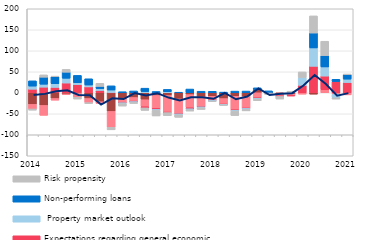
| Category | Costs of funding | Competition from other banks | Expectations regarding general economic situation |  Property market outlook | Non-performing loans  | Risk propensity |
|---|---|---|---|---|---|---|
| 2014.0 | -27.614 | -10.883 | 8.513 | 7.366 | 12.572 | -2.931 |
| nan | -30.154 | -23.565 | 13.381 | 6.958 | 16.79 | 5.591 |
| nan | -13.58 | -4.04 | 12.84 | 8.698 | 16.68 | 1.322 |
| nan | -3.194 | -0.943 | 23.215 | 11.346 | 14.413 | 6.815 |
| 2015.0 | 1.584 | -10.634 | 17.798 | 4.391 | 17.665 | -4.309 |
| nan | -13.709 | -9.748 | 14.011 | 4.433 | 14.906 | -2.291 |
| nan | -21.32 | -4.036 | 5.521 | 4.364 | 5.262 | 7.435 |
| nan | -44.371 | -37.787 | 0.672 | 5.886 | 9.984 | -6.068 |
| 2016.0 | -13.683 | -9.865 | -0.183 | -2.017 | 2.537 | -5.896 |
| nan | -11.339 | -9.602 | -0.197 | -1.974 | 4.34 | -2.332 |
| nan | -16.54 | -16.708 | -2.652 | 2.885 | 8.061 | -6.073 |
| nan | -6.439 | -30.804 | -2.596 | -1.957 | 3.101 | -13.396 |
| 2017.0 | -6.563 | -40.484 | -0.096 | 2.394 | 5.669 | -7.434 |
| nan | -14.708 | -34.121 | -1.211 | -2.234 | 1.309 | -6.144 |
| nan | -4.365 | -31.359 | -2.483 | -2.033 | 8.902 | -3.307 |
| nan | -9.63 | -23.589 | -0.294 | -2.083 | 3.686 | -4.267 |
| 2018.0 | -8.401 | -9.465 | -0.308 | -2.087 | 3.545 | -0.758 |
| nan | -13.817 | -13.719 | -0.384 | -1.143 | 1.627 | -1.188 |
| nan | -8.391 | -32.723 | -0.405 | -2.001 | 3.96 | -10.656 |
| nan | -8.386 | -28.581 | -0.415 | -2.043 | 4.097 | -3.682 |
| 2019.0 | 7.614 | -12.529 | -0.41 | -2.062 | 4.174 | -3.764 |
| nan | -0.003 | 0 | -0.494 | 0 | 4.55 | -3.594 |
| nan | -3.529 | -4.583 | -0.546 | 0 | 0 | -6.275 |
| nan | -3.387 | -3.387 | -0.556 | 0 | 0 | 3.746 |
| 2020.0 | 0 | -3.3 | 17.776 | 18.324 | 0 | 13.5 |
| nan | -3.3 | 0 | 63.053 | 43.711 | 35.524 | 40.8 |
| nan | 0 | 7.2 | 32.599 | 21.695 | 27.071 | 34.2 |
| nan | -0.778 | -3.063 | 26.746 | -8.12 | 5.298 | -3.047 |
| 2021.0 | 0 | -5.032 | 24.468 | 7.975 | 11.008 | 0.658 |